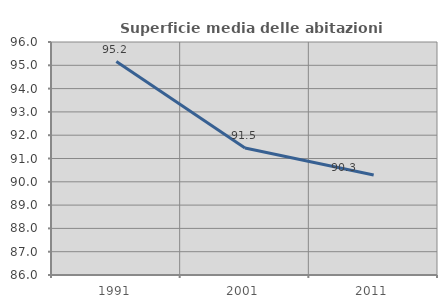
| Category | Superficie media delle abitazioni occupate |
|---|---|
| 1991.0 | 95.162 |
| 2001.0 | 91.454 |
| 2011.0 | 90.288 |